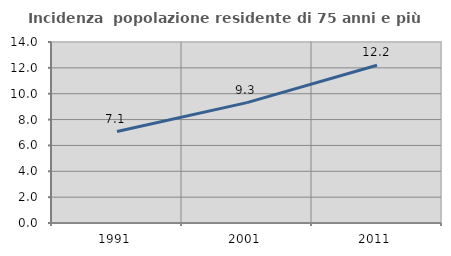
| Category | Incidenza  popolazione residente di 75 anni e più |
|---|---|
| 1991.0 | 7.074 |
| 2001.0 | 9.311 |
| 2011.0 | 12.197 |